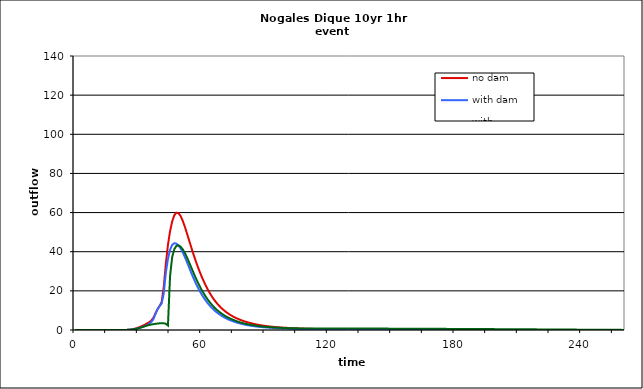
| Category | no dam | with dam | with dam/pond |
|---|---|---|---|
| 0.0 | 0 | 0 | 0 |
| 1.0 | 0 | 0 | 0 |
| 2.0 | 0 | 0 | 0 |
| 3.0 | 0 | 0 | 0 |
| 4.0 | 0 | 0 | 0 |
| 5.0 | 0 | 0 | 0 |
| 6.0 | 0 | 0 | 0 |
| 7.0 | 0 | 0 | 0 |
| 8.0 | 0 | 0 | 0 |
| 9.0 | 0 | 0 | 0 |
| 10.0 | 0 | 0 | 0 |
| 11.0 | 0 | 0 | 0 |
| 12.0 | 0 | 0 | 0 |
| 13.0 | 0 | 0 | 0 |
| 14.0 | 0 | 0 | 0 |
| 15.0 | 0 | 0 | 0 |
| 16.0 | 0 | 0 | 0 |
| 17.0 | 0 | 0 | 0 |
| 18.0 | 0 | 0 | 0 |
| 19.0 | 0 | 0 | 0 |
| 20.0 | 0 | 0 | 0 |
| 21.0 | 0 | 0 | 0 |
| 22.0 | 0.002 | 0.002 | 0.002 |
| 23.0 | 0.009 | 0.01 | 0.01 |
| 24.0 | 0.032 | 0.032 | 0.032 |
| 25.0 | 0.082 | 0.075 | 0.075 |
| 26.0 | 0.179 | 0.144 | 0.144 |
| 27.0 | 0.341 | 0.25 | 0.249 |
| 28.0 | 0.578 | 0.403 | 0.402 |
| 29.0 | 0.89 | 0.613 | 0.611 |
| 30.0 | 1.267 | 0.878 | 0.876 |
| 31.0 | 1.696 | 1.189 | 1.187 |
| 32.0 | 2.175 | 1.538 | 1.533 |
| 33.0 | 2.699 | 1.92 | 1.898 |
| 34.0 | 3.295 | 2.391 | 2.239 |
| 35.0 | 3.924 | 3.068 | 2.529 |
| 36.0 | 4.682 | 3.933 | 2.771 |
| 37.0 | 6.057 | 5.3 | 2.973 |
| 38.0 | 8.279 | 7.956 | 3.137 |
| 39.0 | 10.488 | 10.5 | 3.275 |
| 40.0 | 12.167 | 12.201 | 3.406 |
| 41.0 | 14.226 | 13.458 | 3.474 |
| 42.0 | 21.856 | 18.602 | 3.426 |
| 43.0 | 33.82 | 29.182 | 3.184 |
| 44.0 | 43.476 | 36.327 | 2.276 |
| 45.0 | 50.456 | 40.951 | 27.445 |
| 46.0 | 55.435 | 43.491 | 37.204 |
| 47.0 | 58.597 | 44.358 | 41.28 |
| 48.0 | 59.935 | 44.141 | 42.977 |
| 49.0 | 59.698 | 43.2 | 43.24 |
| 50.0 | 58.231 | 41.688 | 42.561 |
| 51.0 | 55.806 | 39.686 | 41.208 |
| 52.0 | 52.772 | 37.313 | 39.354 |
| 53.0 | 49.397 | 34.71 | 37.138 |
| 54.0 | 45.891 | 32.011 | 34.656 |
| 55.0 | 42.392 | 29.327 | 32.082 |
| 56.0 | 38.994 | 26.739 | 29.516 |
| 57.0 | 35.757 | 24.304 | 27.008 |
| 58.0 | 32.715 | 22.054 | 24.655 |
| 59.0 | 29.875 | 19.997 | 22.453 |
| 60.0 | 27.231 | 18.13 | 20.416 |
| 61.0 | 24.779 | 16.432 | 18.581 |
| 62.0 | 22.511 | 14.886 | 16.867 |
| 63.0 | 20.431 | 13.485 | 15.311 |
| 64.0 | 18.537 | 12.216 | 13.929 |
| 65.0 | 16.823 | 11.075 | 12.655 |
| 66.0 | 15.281 | 10.048 | 11.483 |
| 67.0 | 13.902 | 9.123 | 10.452 |
| 68.0 | 12.661 | 8.291 | 9.548 |
| 69.0 | 11.541 | 7.544 | 8.72 |
| 70.0 | 10.534 | 6.871 | 7.942 |
| 71.0 | 9.628 | 6.264 | 7.238 |
| 72.0 | 8.812 | 5.717 | 6.621 |
| 73.0 | 8.076 | 5.224 | 6.08 |
| 74.0 | 7.411 | 4.78 | 5.598 |
| 75.0 | 6.808 | 4.378 | 5.157 |
| 76.0 | 6.26 | 4.013 | 4.724 |
| 77.0 | 5.763 | 3.682 | 4.318 |
| 78.0 | 5.31 | 3.381 | 3.961 |
| 79.0 | 4.899 | 3.106 | 3.649 |
| 80.0 | 4.523 | 2.854 | 3.372 |
| 81.0 | 4.18 | 2.624 | 3.123 |
| 82.0 | 3.865 | 2.413 | 2.897 |
| 83.0 | 3.575 | 2.222 | 2.691 |
| 84.0 | 3.309 | 2.049 | 2.503 |
| 85.0 | 3.063 | 1.897 | 2.328 |
| 86.0 | 2.836 | 1.763 | 2.162 |
| 87.0 | 2.627 | 1.644 | 2.009 |
| 88.0 | 2.433 | 1.536 | 1.873 |
| 89.0 | 2.257 | 1.437 | 1.753 |
| 90.0 | 2.1 | 1.347 | 1.647 |
| 91.0 | 1.959 | 1.264 | 1.551 |
| 92.0 | 1.831 | 1.187 | 1.463 |
| 93.0 | 1.714 | 1.117 | 1.383 |
| 94.0 | 1.607 | 1.051 | 1.309 |
| 95.0 | 1.509 | 0.99 | 1.241 |
| 96.0 | 1.419 | 0.934 | 1.177 |
| 97.0 | 1.336 | 0.881 | 1.118 |
| 98.0 | 1.259 | 0.832 | 1.063 |
| 99.0 | 1.188 | 0.786 | 1.011 |
| 100.0 | 1.121 | 0.743 | 0.964 |
| 101.0 | 1.06 | 0.703 | 0.921 |
| 102.0 | 1.002 | 0.665 | 0.885 |
| 103.0 | 0.948 | 0.63 | 0.859 |
| 104.0 | 0.898 | 0.597 | 0.843 |
| 105.0 | 0.85 | 0.566 | 0.833 |
| 106.0 | 0.806 | 0.537 | 0.829 |
| 107.0 | 0.764 | 0.509 | 0.826 |
| 108.0 | 0.725 | 0.484 | 0.824 |
| 109.0 | 0.688 | 0.459 | 0.822 |
| 110.0 | 0.653 | 0.437 | 0.82 |
| 111.0 | 0.621 | 0.415 | 0.818 |
| 112.0 | 0.59 | 0.395 | 0.816 |
| 113.0 | 0.561 | 0.376 | 0.814 |
| 114.0 | 0.534 | 0.358 | 0.812 |
| 115.0 | 0.508 | 0.342 | 0.809 |
| 116.0 | 0.484 | 0.326 | 0.807 |
| 117.0 | 0.461 | 0.311 | 0.804 |
| 118.0 | 0.44 | 0.297 | 0.802 |
| 119.0 | 0.419 | 0.283 | 0.799 |
| 120.0 | 0.4 | 0.271 | 0.797 |
| 121.0 | 0.382 | 0.259 | 0.794 |
| 122.0 | 0.365 | 0.247 | 0.791 |
| 123.0 | 0.349 | 0.237 | 0.788 |
| 124.0 | 0.333 | 0.226 | 0.785 |
| 125.0 | 0.319 | 0.217 | 0.782 |
| 126.0 | 0.305 | 0.208 | 0.779 |
| 127.0 | 0.291 | 0.199 | 0.776 |
| 128.0 | 0.279 | 0.191 | 0.773 |
| 129.0 | 0.267 | 0.183 | 0.77 |
| 130.0 | 0.256 | 0.175 | 0.767 |
| 131.0 | 0.245 | 0.168 | 0.764 |
| 132.0 | 0.235 | 0.161 | 0.76 |
| 133.0 | 0.225 | 0.155 | 0.757 |
| 134.0 | 0.216 | 0.149 | 0.754 |
| 135.0 | 0.207 | 0.143 | 0.75 |
| 136.0 | 0.199 | 0.137 | 0.747 |
| 137.0 | 0.191 | 0.132 | 0.744 |
| 138.0 | 0.183 | 0.127 | 0.74 |
| 139.0 | 0.176 | 0.122 | 0.737 |
| 140.0 | 0.169 | 0.117 | 0.733 |
| 141.0 | 0.163 | 0.113 | 0.729 |
| 142.0 | 0.156 | 0.109 | 0.726 |
| 143.0 | 0.15 | 0.105 | 0.722 |
| 144.0 | 0.145 | 0.101 | 0.718 |
| 145.0 | 0.139 | 0.097 | 0.715 |
| 146.0 | 0.134 | 0.094 | 0.711 |
| 147.0 | 0.129 | 0.09 | 0.707 |
| 148.0 | 0.124 | 0.087 | 0.703 |
| 149.0 | 0.12 | 0.084 | 0.699 |
| 150.0 | 0.115 | 0.081 | 0.696 |
| 151.0 | 0.111 | 0.078 | 0.692 |
| 152.0 | 0.107 | 0.075 | 0.688 |
| 153.0 | 0.103 | 0.073 | 0.684 |
| 154.0 | 0.1 | 0.07 | 0.68 |
| 155.0 | 0.096 | 0.068 | 0.676 |
| 156.0 | 0.093 | 0.066 | 0.672 |
| 157.0 | 0.089 | 0.063 | 0.668 |
| 158.0 | 0.086 | 0.061 | 0.663 |
| 159.0 | 0.083 | 0.059 | 0.659 |
| 160.0 | 0.08 | 0.057 | 0.655 |
| 161.0 | 0.078 | 0.055 | 0.65 |
| 162.0 | 0.075 | 0.054 | 0.645 |
| 163.0 | 0.072 | 0.052 | 0.64 |
| 164.0 | 0.07 | 0.05 | 0.635 |
| 165.0 | 0.068 | 0.049 | 0.63 |
| 166.0 | 0.065 | 0.047 | 0.625 |
| 167.0 | 0.063 | 0.046 | 0.62 |
| 168.0 | 0.061 | 0.044 | 0.615 |
| 169.0 | 0.059 | 0.043 | 0.61 |
| 170.0 | 0.057 | 0.041 | 0.605 |
| 171.0 | 0.055 | 0.04 | 0.6 |
| 172.0 | 0.053 | 0.039 | 0.594 |
| 173.0 | 0.052 | 0.038 | 0.589 |
| 174.0 | 0.05 | 0.037 | 0.584 |
| 175.0 | 0.048 | 0.036 | 0.579 |
| 176.0 | 0.047 | 0.034 | 0.574 |
| 177.0 | 0.045 | 0.033 | 0.568 |
| 178.0 | 0.044 | 0.032 | 0.563 |
| 179.0 | 0.042 | 0.031 | 0.558 |
| 180.0 | 0.041 | 0.031 | 0.552 |
| 181.0 | 0.04 | 0.03 | 0.547 |
| 182.0 | 0.039 | 0.029 | 0.541 |
| 183.0 | 0.037 | 0.028 | 0.536 |
| 184.0 | 0.036 | 0.027 | 0.53 |
| 185.0 | 0.035 | 0.026 | 0.525 |
| 186.0 | 0.034 | 0.026 | 0.52 |
| 187.0 | 0.033 | 0.025 | 0.514 |
| 188.0 | 0.032 | 0.024 | 0.508 |
| 189.0 | 0.031 | 0.024 | 0.503 |
| 190.0 | 0.03 | 0.023 | 0.497 |
| 191.0 | 0.029 | 0.022 | 0.492 |
| 192.0 | 0.028 | 0.022 | 0.486 |
| 193.0 | 0.027 | 0.021 | 0.48 |
| 194.0 | 0.027 | 0.02 | 0.474 |
| 195.0 | 0.026 | 0.02 | 0.468 |
| 196.0 | 0.025 | 0.019 | 0.462 |
| 197.0 | 0.024 | 0.019 | 0.456 |
| 198.0 | 0.024 | 0.018 | 0.45 |
| 199.0 | 0.023 | 0.018 | 0.443 |
| 200.0 | 0.022 | 0.017 | 0.437 |
| 201.0 | 0.021 | 0.017 | 0.431 |
| 202.0 | 0.021 | 0.016 | 0.425 |
| 203.0 | 0.02 | 0.016 | 0.418 |
| 204.0 | 0.02 | 0.016 | 0.412 |
| 205.0 | 0.019 | 0.015 | 0.406 |
| 206.0 | 0.019 | 0.015 | 0.399 |
| 207.0 | 0.018 | 0.014 | 0.393 |
| 208.0 | 0.017 | 0.014 | 0.387 |
| 209.0 | 0.017 | 0.014 | 0.38 |
| 210.0 | 0.016 | 0.013 | 0.374 |
| 211.0 | 0.016 | 0.013 | 0.368 |
| 212.0 | 0.015 | 0.013 | 0.361 |
| 213.0 | 0.015 | 0.012 | 0.355 |
| 214.0 | 0.015 | 0.012 | 0.349 |
| 215.0 | 0.014 | 0.012 | 0.342 |
| 216.0 | 0.014 | 0.011 | 0.336 |
| 217.0 | 0.013 | 0.011 | 0.329 |
| 218.0 | 0.013 | 0.011 | 0.323 |
| 219.0 | 0.012 | 0.01 | 0.316 |
| 220.0 | 0.012 | 0.01 | 0.31 |
| 221.0 | 0.012 | 0.01 | 0.303 |
| 222.0 | 0.011 | 0.009 | 0.296 |
| 223.0 | 0.011 | 0.009 | 0.289 |
| 224.0 | 0.01 | 0.009 | 0.282 |
| 225.0 | 0.01 | 0.008 | 0.275 |
| 226.0 | 0.01 | 0.008 | 0.269 |
| 227.0 | 0.009 | 0.008 | 0.262 |
| 228.0 | 0.009 | 0.008 | 0.255 |
| 229.0 | 0.009 | 0.007 | 0.248 |
| 230.0 | 0.008 | 0.007 | 0.241 |
| 231.0 | 0.008 | 0.007 | 0.235 |
| 232.0 | 0.008 | 0.007 | 0.228 |
| 233.0 | 0.007 | 0.006 | 0.221 |
| 234.0 | 0.007 | 0.006 | 0.215 |
| 235.0 | 0.007 | 0.006 | 0.208 |
| 236.0 | 0.006 | 0.006 | 0.201 |
| 237.0 | 0.006 | 0.005 | 0.195 |
| 238.0 | 0.006 | 0.005 | 0.189 |
| 239.0 | 0.006 | 0.005 | 0.182 |
| 240.0 | 0.005 | 0.005 | 0.176 |
| 241.0 | 0.005 | 0.005 | 0.169 |
| 242.0 | 0.005 | 0.004 | 0.163 |
| 243.0 | 0.004 | 0.004 | 0.156 |
| 244.0 | 0.004 | 0.004 | 0.149 |
| 245.0 | 0.004 | 0.004 | 0.142 |
| 246.0 | 0.004 | 0.004 | 0.135 |
| 247.0 | 0.004 | 0.003 | 0.128 |
| 248.0 | 0.003 | 0.003 | 0.121 |
| 249.0 | 0.003 | 0.003 | 0.114 |
| 250.0 | 0.003 | 0.003 | 0.108 |
| 251.0 | 0.003 | 0.003 | 0.101 |
| 252.0 | 0.003 | 0.003 | 0.095 |
| 253.0 | 0.002 | 0.002 | 0.09 |
| 254.0 | 0.002 | 0.002 | 0.084 |
| 255.0 | 0.002 | 0.002 | 0.079 |
| 256.0 | 0.002 | 0.002 | 0.075 |
| 257.0 | 0.002 | 0.002 | 0.07 |
| 258.0 | 0.002 | 0.002 | 0.066 |